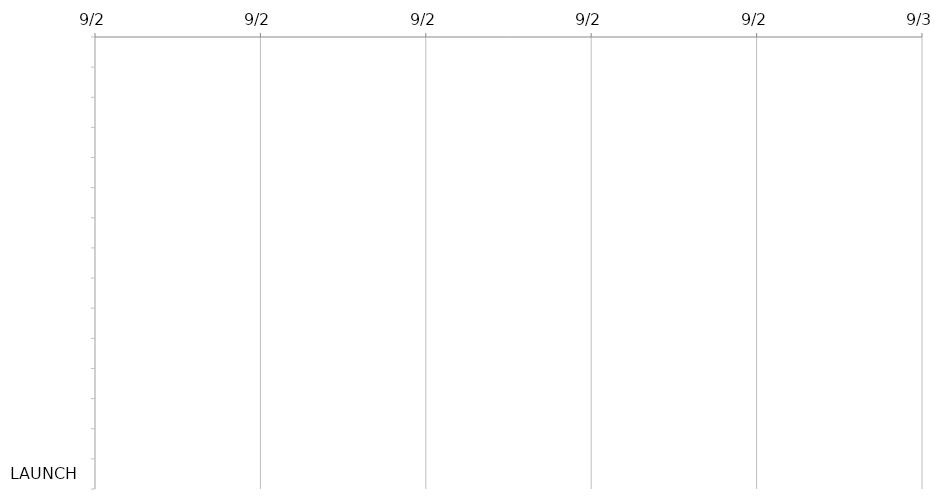
| Category | START | DAYS |
|---|---|---|
|  |  | 0 |
|  |  | 0 |
|  |  | 0 |
|  |  | 0 |
|  |  | 0 |
|  |  | 0 |
|  |  | 0 |
|  |  | 0 |
|  |  | 0 |
|  |  | 0 |
|  |  | 0 |
|  |  | 0 |
|  |  | 0 |
|  |  | 0 |
| LAUNCH |  | 0 |